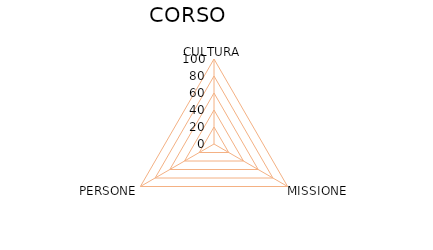
| Category | Series 0 |
|---|---|
| CULTURA | 0 |
| MISSIONE | 0 |
| PERSONE | 0 |